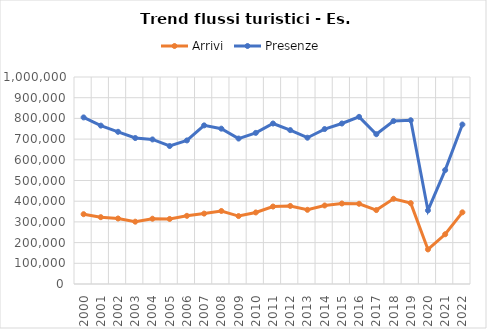
| Category | Arrivi | Presenze |
|---|---|---|
| 2000.0 | 337312 | 804739 |
| 2001.0 | 322849 | 765212 |
| 2002.0 | 316421 | 735261 |
| 2003.0 | 300996 | 705170 |
| 2004.0 | 315322 | 698352 |
| 2005.0 | 314206 | 666548 |
| 2006.0 | 329289 | 693579 |
| 2007.0 | 340085 | 766245 |
| 2008.0 | 352771 | 750387 |
| 2009.0 | 328194 | 702633 |
| 2010.0 | 345596 | 729997 |
| 2011.0 | 374208 | 775263 |
| 2012.0 | 377118 | 743444 |
| 2013.0 | 358413 | 706691 |
| 2014.0 | 379262 | 748581 |
| 2015.0 | 388932 | 775357 |
| 2016.0 | 387550 | 807469 |
| 2017.0 | 357130 | 723639 |
| 2018.0 | 411719 | 787074 |
| 2019.0 | 390707 | 791062 |
| 2020.0 | 167024 | 355511 |
| 2021.0 | 240267 | 550407 |
| 2022.0 | 346214 | 770449 |